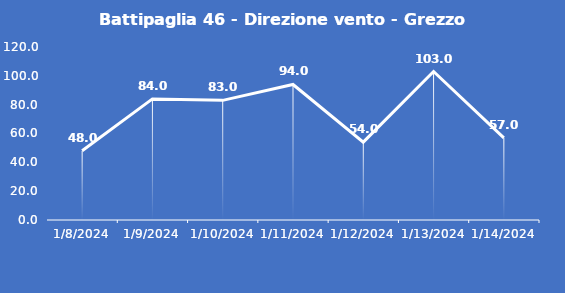
| Category | Battipaglia 46 - Direzione vento - Grezzo (°N) |
|---|---|
| 1/8/24 | 48 |
| 1/9/24 | 84 |
| 1/10/24 | 83 |
| 1/11/24 | 94 |
| 1/12/24 | 54 |
| 1/13/24 | 103 |
| 1/14/24 | 57 |